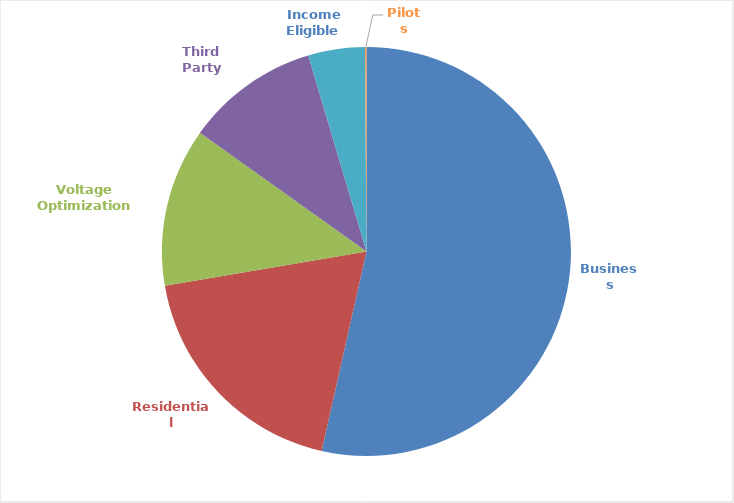
| Category | Series 0 |
|---|---|
| Business | 922921491.736 |
| Residential | 324159469.761 |
| Voltage Optimization | 215996316.176 |
| Third Party | 181998086.363 |
| Income Eligible | 77313232.409 |
| Pilots | 1943796.044 |